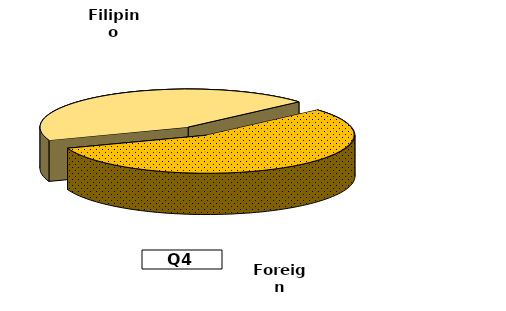
| Category | Series 0 |
|---|---|
| Filipino | 103.708 |
| Foreign | 131.959 |